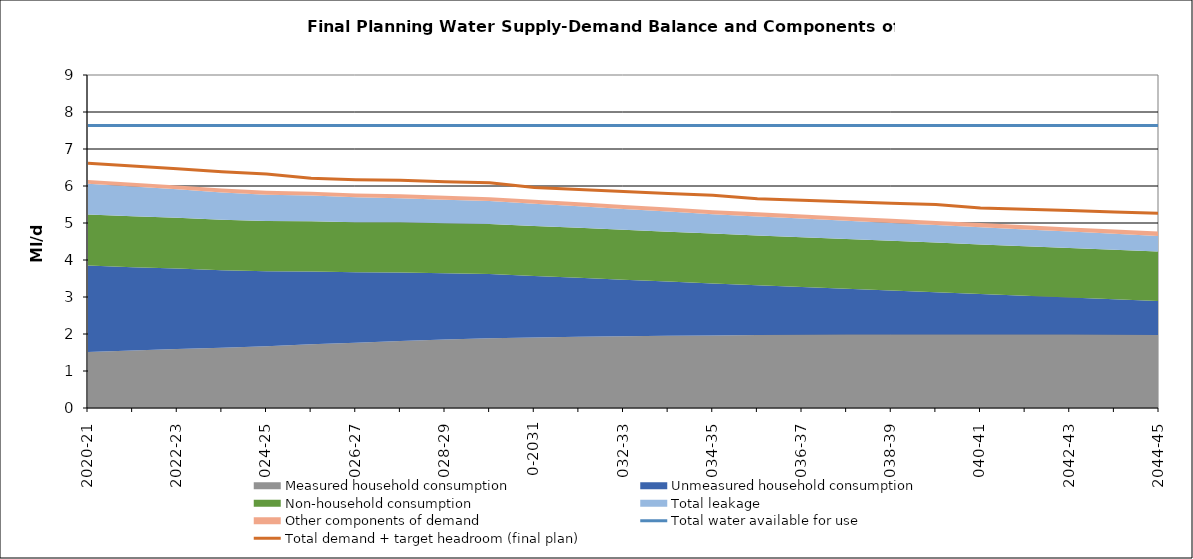
| Category | Total water available for use | Total demand + target headroom (final plan) |
|---|---|---|
| 0 | 7.638 | 6.612 |
| 1 | 7.638 | 6.538 |
| 2 | 7.638 | 6.464 |
| 3 | 7.638 | 6.386 |
| 4 | 7.638 | 6.325 |
| 5 | 7.638 | 6.21 |
| 6 | 7.638 | 6.171 |
| 7 | 7.638 | 6.153 |
| 8 | 7.638 | 6.118 |
| 9 | 7.638 | 6.086 |
| 10 | 7.638 | 5.957 |
| 11 | 7.638 | 5.907 |
| 12 | 7.638 | 5.853 |
| 13 | 7.638 | 5.8 |
| 14 | 7.638 | 5.751 |
| 15 | 7.638 | 5.652 |
| 16 | 7.638 | 5.615 |
| 17 | 7.638 | 5.577 |
| 18 | 7.638 | 5.533 |
| 19 | 7.638 | 5.5 |
| 20 | 7.638 | 5.403 |
| 21 | 7.638 | 5.369 |
| 22 | 7.638 | 5.337 |
| 23 | 7.638 | 5.296 |
| 24 | 7.638 | 5.263 |